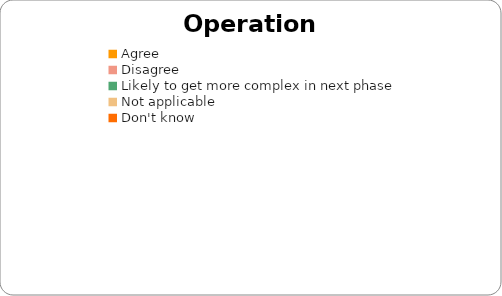
| Category | OPERATIONAL |
|---|---|
| Agree | 0 |
| Disagree | 0 |
| Likely to get more complex in next phase | 0 |
| Not applicable | 0 |
| Don't know | 0 |